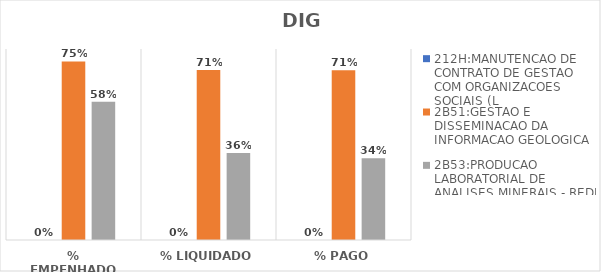
| Category | 212H:MANUTENCAO DE CONTRATO DE GESTAO COM ORGANIZACOES SOCIAIS (L | 2B51:GESTAO E DISSEMINACAO DA INFORMACAO GEOLOGICA | 2B53:PRODUCAO LABORATORIAL DE ANALISES MINERAIS - REDE LAMIN |
|---|---|---|---|
| % EMPENHADO | 0 | 0.748 | 0.579 |
| % LIQUIDADO | 0 | 0.712 | 0.364 |
| % PAGO | 0 | 0.711 | 0.343 |